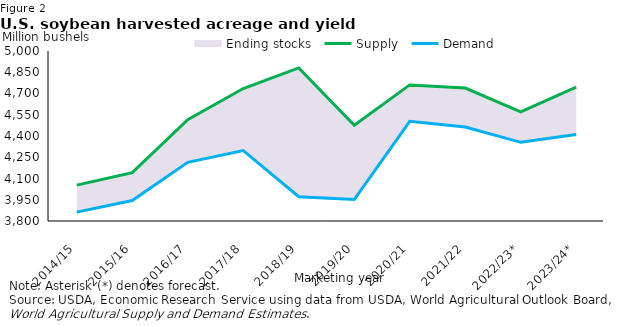
| Category | Supply | Demand |
|---|---|---|
| 2014/15 | 4053.286 | 3862.676 |
| 2015/16 | 4140.93 | 3944.201 |
| 2016/17 | 4515.506 | 4213.911 |
| 2017/18 | 4735.039 | 4296.934 |
| 2018/19 | 4880.312 | 3971.26 |
| 2019/20 | 4476.341 | 3951.8 |
| 2020/21 | 4760.658 | 4503.679 |
| 2021/22 | 4738.271 | 4463.877 |
| 2022/23* | 4570.517 | 4355.278 |
| 2023/24* | 4745.239 | 4410.561 |